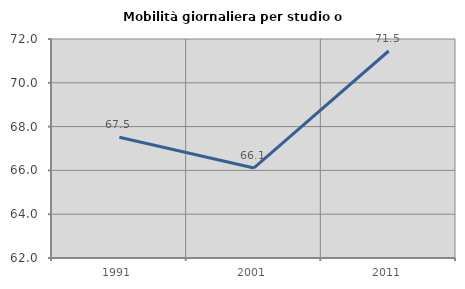
| Category | Mobilità giornaliera per studio o lavoro |
|---|---|
| 1991.0 | 67.512 |
| 2001.0 | 66.11 |
| 2011.0 | 71.452 |